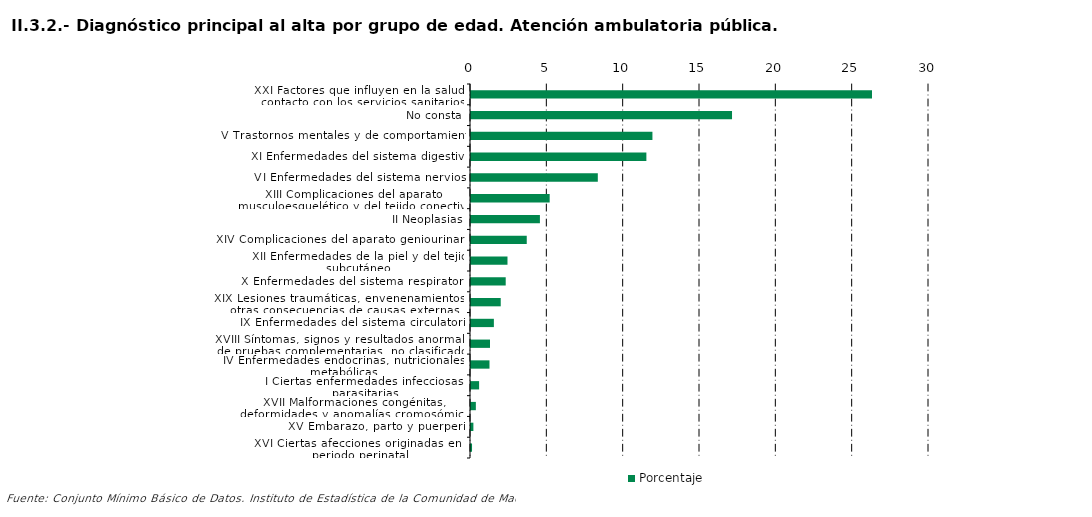
| Category | Porcentaje |
|---|---|
| XXI Factores que influyen en la salud y contacto con los servicios sanitarios | 26.266 |
| No consta | 17.098 |
| V Trastornos mentales y de comportamiento | 11.884 |
| XI Enfermedades del sistema digestivo | 11.487 |
| VI Enfermedades del sistema nervioso | 8.306 |
| XIII Complicaciones del aparato musculoesquelético y del tejido conectivo | 5.153 |
| II Neoplasias | 4.514 |
| XIV Complicaciones del aparato geniourinario | 3.652 |
| XII Enfermedades de la piel y del tejido subcutáneo | 2.39 |
| X Enfermedades del sistema respiratorio | 2.273 |
| XIX Lesiones traumáticas, envenenamientos y otras consecuencias de causas externas | 1.948 |
| IX Enfermedades del sistema circulatorio | 1.498 |
| XVIII Síntomas, signos y resultados anormales de pruebas complementarias, no clasificados bajo otro concepto | 1.245 |
| IV Enfermedades endocrinas, nutricionales y metabólicas | 1.211 |
| I Ciertas enfermedades infecciosas y parasitarias | 0.53 |
| XVII Malformaciones congénitas, deformidades y anomalías cromosómicas | 0.318 |
| XV Embarazo, parto y puerperio | 0.156 |
| XVI Ciertas afecciones originadas en el periodo perinatal | 0.068 |